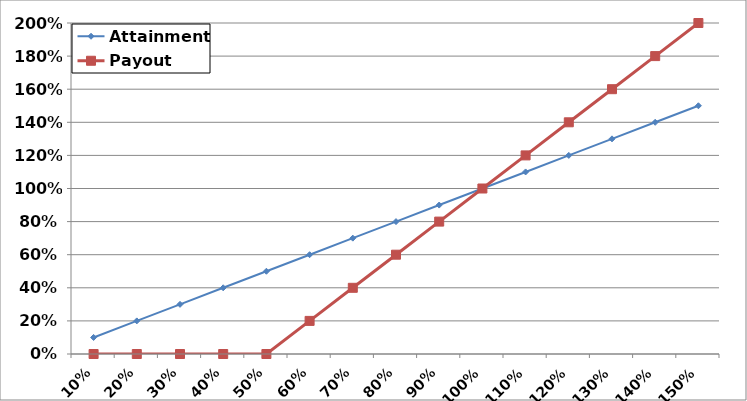
| Category | Attainment | Payout |
|---|---|---|
| 10% | 0.1 | 0 |
| 20% | 0.2 | 0 |
| 30% | 0.3 | 0 |
| 40% | 0.4 | 0 |
| 50% | 0.5 | 0 |
| 60% | 0.6 | 0.2 |
| 70% | 0.7 | 0.4 |
| 80% | 0.8 | 0.6 |
| 90% | 0.9 | 0.8 |
| 100% | 1 | 1 |
| 110% | 1.1 | 1.2 |
| 120% | 1.2 | 1.4 |
| 130% | 1.3 | 1.6 |
| 140% | 1.4 | 1.8 |
| 150% | 1.5 | 2 |